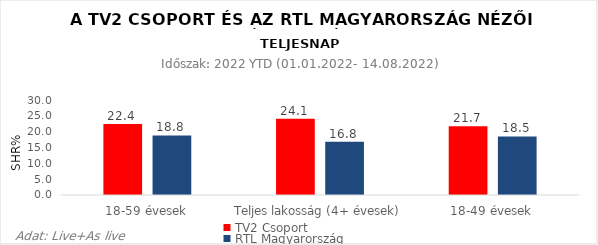
| Category | TV2 Csoport | RTL Magyarország |
|---|---|---|
| 18-59 évesek | 22.4 | 18.8 |
| Teljes lakosság (4+ évesek) | 24.1 | 16.8 |
| 18-49 évesek | 21.7 | 18.5 |